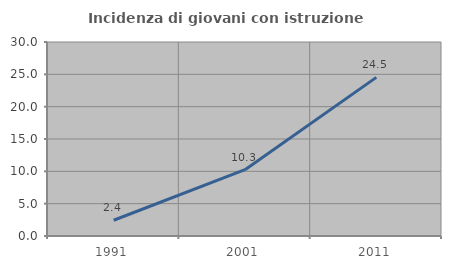
| Category | Incidenza di giovani con istruzione universitaria |
|---|---|
| 1991.0 | 2.439 |
| 2001.0 | 10.256 |
| 2011.0 | 24.528 |